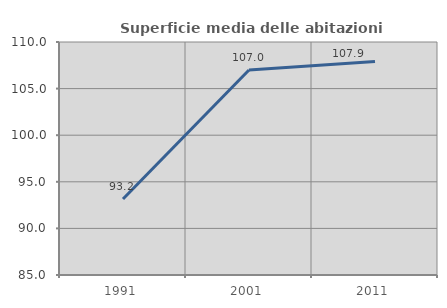
| Category | Superficie media delle abitazioni occupate |
|---|---|
| 1991.0 | 93.154 |
| 2001.0 | 106.994 |
| 2011.0 | 107.916 |